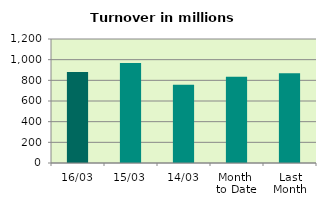
| Category | Series 0 |
|---|---|
| 16/03 | 879.82 |
| 15/03 | 967.682 |
| 14/03 | 756.33 |
| Month 
to Date | 834.506 |
| Last
Month | 868.35 |